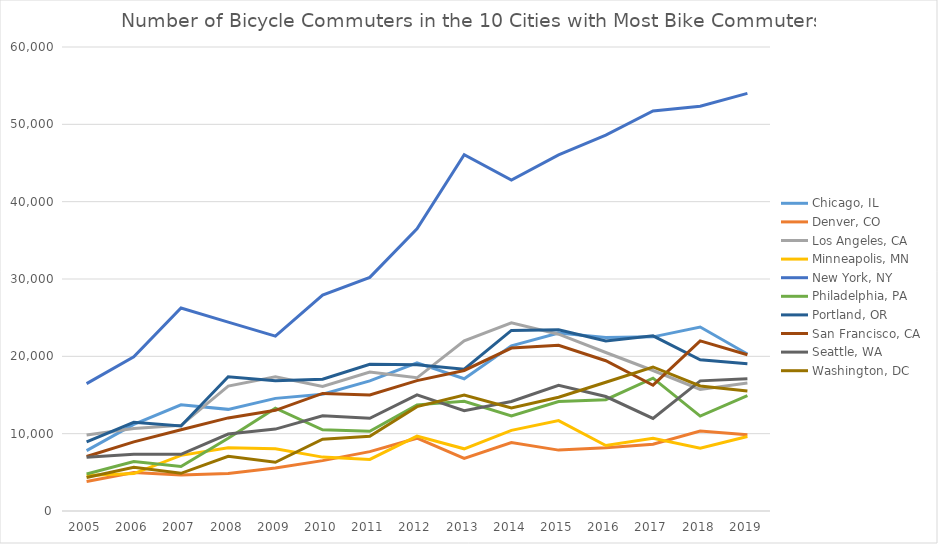
| Category | Chicago, IL | Denver, CO | Los Angeles, CA | Minneapolis, MN | New York, NY | Philadelphia, PA | Portland, OR | San Francisco, CA | Seattle, WA | Washington, DC |
|---|---|---|---|---|---|---|---|---|---|---|
| 2005.0 | 7812 | 3814 | 9821 | 4589 | 16468 | 4778 | 8942 | 7053 | 6963 | 4336 |
| 2006.0 | 11193 | 4988 | 10664 | 4835 | 19953 | 6403 | 11477 | 8938 | 7330 | 5667 |
| 2007.0 | 13736 | 4657 | 11081 | 7198 | 26243 | 5753 | 10987 | 10514 | 7336 | 4871 |
| 2008.0 | 13143 | 4864 | 16147 | 8164 | 24428 | 9410 | 17365 | 12038 | 9953 | 7066 |
| 2009.0 | 14565 | 5554 | 17345 | 8036 | 22619 | 13304 | 16846 | 13023 | 10593 | 6306 |
| 2010.0 | 15096 | 6514 | 16101 | 6969 | 27917 | 10503 | 17035 | 15208 | 12306 | 9288 |
| 2011.0 | 16833 | 7678 | 17957 | 6670 | 30206 | 10320 | 18977 | 15016 | 11986 | 9669 |
| 2012.0 | 19147 | 9416 | 17223 | 9688 | 36496 | 13726 | 18912 | 16864 | 15007 | 13493 |
| 2013.0 | 17102 | 6791 | 21999 | 8041 | 46065 | 14177 | 18337 | 18174 | 12983 | 14986 |
| 2014.0 | 21362 | 8848 | 24334 | 10426 | 42806 | 12281 | 23347 | 21068 | 14157 | 13330 |
| 2015.0 | 23011 | 7873 | 22865 | 11688 | 46057 | 14167 | 23432 | 21427 | 16251 | 14718 |
| 2016.0 | 22449 | 8181 | 20495 | 8465 | 48601 | 14397 | 21982 | 19429 | 14801 | 16647 |
| 2017.0 | 22520 | 8628 | 18171 | 9412 | 51733 | 17180 | 22647 | 16266 | 11976 | 18624 |
| 2018.0 | 23788 | 10336 | 15710 | 8112 | 52346 | 12276 | 19553 | 21999 | 16829 | 16175 |
| 2019.0 | 20309 | 9852 | 16554 | 9629 | 54010 | 14908 | 19052 | 20201 | 17092 | 15528 |